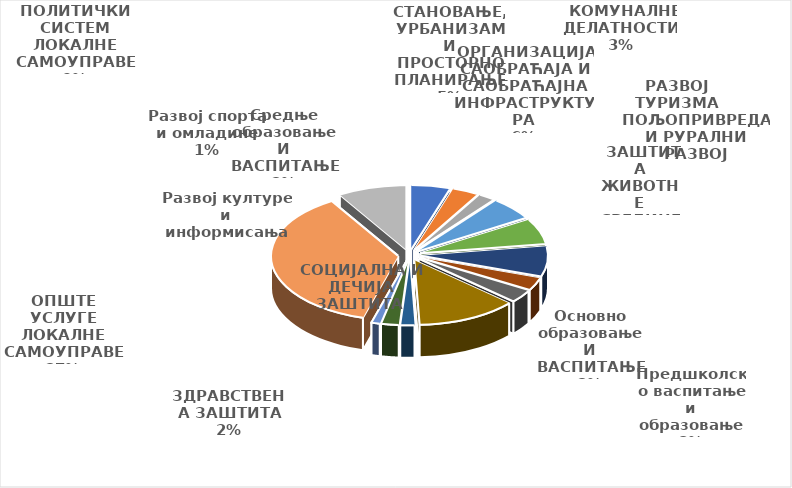
| Category | Series 0 |
|---|---|
| СТАНОВАЊЕ, УРБАНИЗАМ И ПРОСТОРНО ПЛАНИРАЊЕ | 9520000 |
|  КОМУНАЛНЕ ДЕЛАТНОСТИ  | 6560000 |
| РАЗВОЈ ТУРИЗМА | 4070000 |
| ПОЉОПРИВРЕДА И РУРАЛНИ РАЗВОЈ | 0 |
|  ЗАШТИТА ЖИВОТНЕ СРЕДИНЕ | 10900000 |
| ОРГАНИЗАЦИЈА САОБРАЋАЈА И САОБРАЋАЈНА ИНФРАСТРУКТУРА | 12200000 |
| Предшколско васпитање и образовање | 14363000 |
| Основно образовање И ВАСПИТАЊЕ | 6000000 |
| Средње образовање И ВАСПИТАЊЕ | 6150000 |
| СОЦИЈАЛНА И ДЕЧИЈА ЗАШТИТА  | 24243000 |
| ЗДРАВСТВЕНА ЗАШТИТА | 3450000 |
| Развој културе и информисања | 4278000 |
| Развој спорта и омладине | 2050000 |
| ОПШТЕ УСЛУГЕ ЛОКАЛНЕ САМОУПРАВЕ | 70069000 |
| ПОЛИТИЧКИ СИСТЕМ ЛОКАЛНЕ САМОУПРАВЕ | 16690000 |